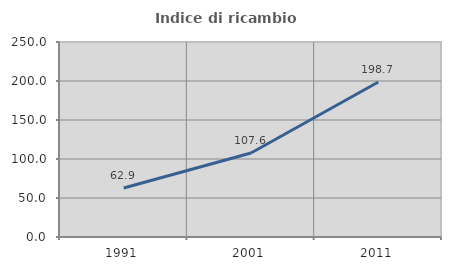
| Category | Indice di ricambio occupazionale  |
|---|---|
| 1991.0 | 62.893 |
| 2001.0 | 107.634 |
| 2011.0 | 198.693 |